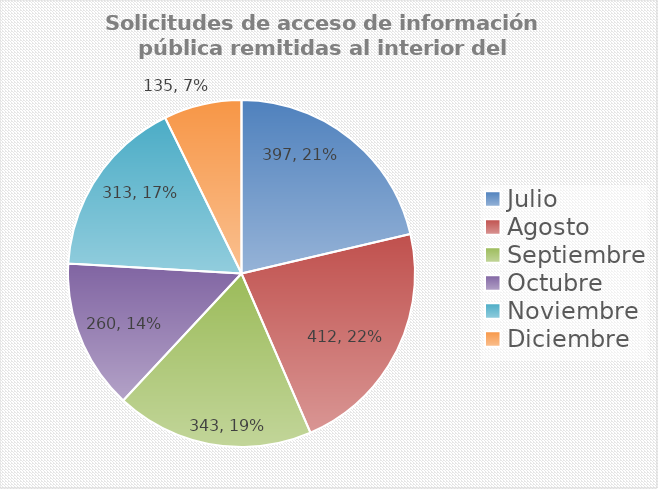
| Category | Series 0 |
|---|---|
| Julio | 397 |
| Agosto | 412 |
| Septiembre | 343 |
| Octubre | 260 |
| Noviembre | 313 |
| Diciembre | 135 |